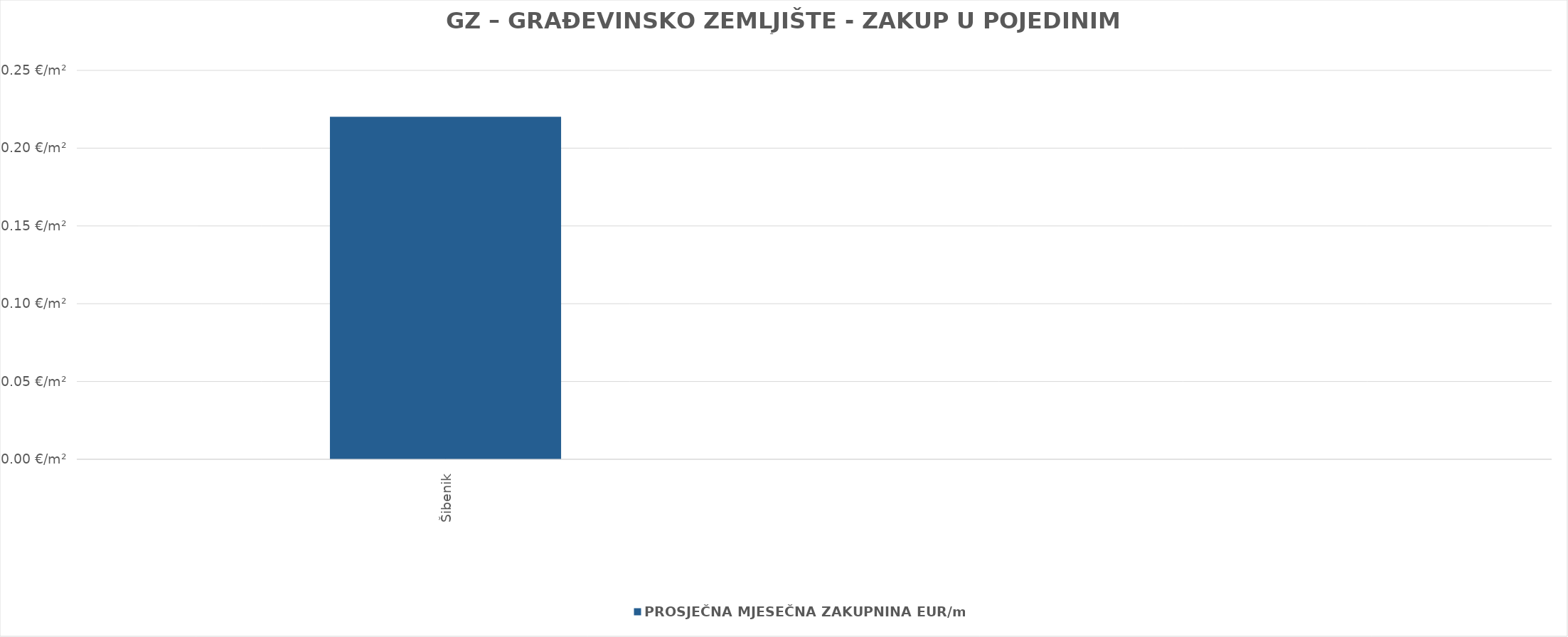
| Category | PROSJEČNA MJESEČNA ZAKUPNINA EUR/m² |
|---|---|
| Šibenik | 0.22 |